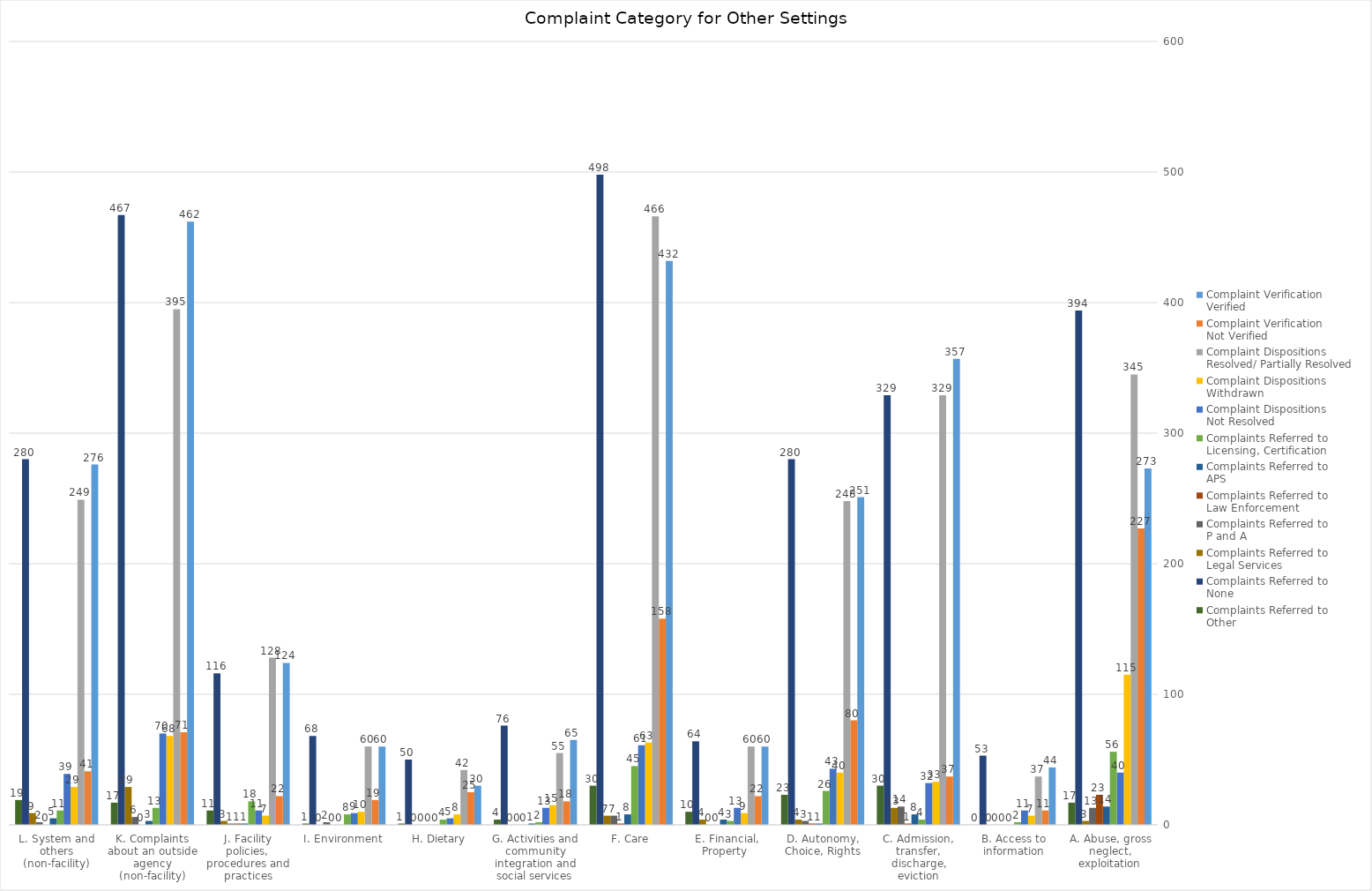
| Category | Complaint Verification
Verified | Complaint Verification 
Not Verified | Complaint Dispositions
Resolved/ Partially Resolved | Complaint Dispositions
Withdrawn | Complaint Dispositions
Not Resolved | Complaints Referred to 
Licensing, Certification  | Complaints Referred to 
APS | Complaints Referred to 
Law Enforcement | Complaints Referred to 
P and A | Complaints Referred to 
Legal Services | Complaints Referred to 
None | Complaints Referred to 
Other |
|---|---|---|---|---|---|---|---|---|---|---|---|---|
| A. Abuse, gross neglect, exploitation | 273 | 227 | 345 | 115 | 40 | 56 | 14 | 23 | 13 | 3 | 394 | 17 |
| B. Access to information | 44 | 11 | 37 | 7 | 11 | 2 | 0 | 0 | 0 | 0 | 53 | 0 |
| C. Admission, transfer, discharge, eviction | 357 | 37 | 329 | 33 | 32 | 4 | 8 | 1 | 14 | 13 | 329 | 30 |
| D. Autonomy, Choice, Rights | 251 | 80 | 248 | 40 | 43 | 26 | 1 | 1 | 3 | 4 | 280 | 23 |
| E. Financial, Property  | 60 | 22 | 60 | 9 | 13 | 3 | 4 | 0 | 0 | 4 | 64 | 10 |
| F. Care | 432 | 158 | 466 | 63 | 61 | 45 | 8 | 1 | 7 | 7 | 498 | 30 |
| G. Activities and community integration and social services | 65 | 18 | 55 | 15 | 13 | 2 | 1 | 0 | 0 | 0 | 76 | 4 |
| H. Dietary | 30 | 25 | 42 | 8 | 5 | 4 | 0 | 0 | 0 | 0 | 50 | 1 |
| I. Environment | 60 | 19 | 60 | 10 | 9 | 8 | 0 | 0 | 2 | 0 | 68 | 1 |
| J. Facility policies, procedures and practices | 124 | 22 | 128 | 7 | 11 | 18 | 1 | 1 | 1 | 3 | 116 | 11 |
| K. Complaints about an outside agency (non-facility) | 462 | 71 | 395 | 68 | 70 | 13 | 3 | 0 | 6 | 29 | 467 | 17 |
| L. System and others (non-facility) | 276 | 41 | 249 | 29 | 39 | 11 | 5 | 0 | 2 | 9 | 280 | 19 |